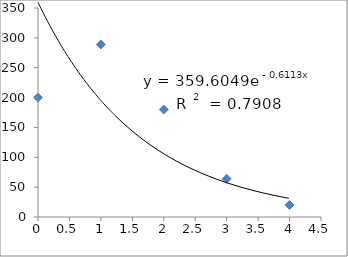
| Category | Series 0 |
|---|---|
| 0.0 | 200 |
| 1.0 | 289 |
| 2.0 | 180 |
| 3.0 | 64 |
| 4.0 | 20 |